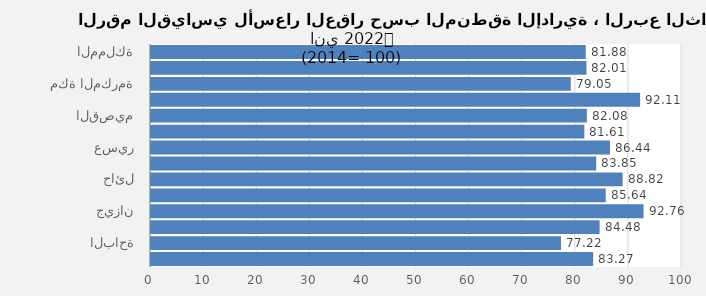
| Category | 2022 الربع الثاني |
|---|---|
| المملكة | 81.879 |
| الرياض | 82.008 |
| مكة المكرمة | 79.05 |
| المدينة المنورة | 92.108 |
| القصيم | 82.083 |
| المنطقة الشرقية | 81.611 |
| عسير | 86.436 |
| تبوك | 83.849 |
| حائل | 88.818 |
| المنطقة الشمالية | 85.64 |
| جيزان | 92.755 |
| نجران | 84.484 |
| الباحة | 77.219 |
| الجوف | 83.274 |